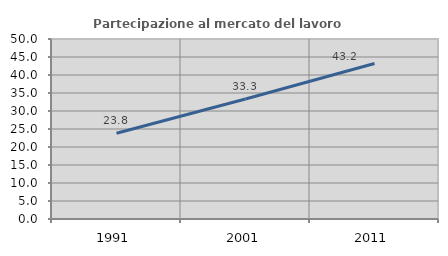
| Category | Partecipazione al mercato del lavoro  femminile |
|---|---|
| 1991.0 | 23.83 |
| 2001.0 | 33.333 |
| 2011.0 | 43.182 |